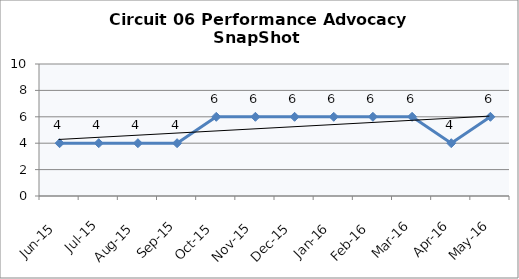
| Category | Circuit 06 |
|---|---|
| Jun-15 | 4 |
| Jul-15 | 4 |
| Aug-15 | 4 |
| Sep-15 | 4 |
| Oct-15 | 6 |
| Nov-15 | 6 |
| Dec-15 | 6 |
| Jan-16 | 6 |
| Feb-16 | 6 |
| Mar-16 | 6 |
| Apr-16 | 4 |
| May-16 | 6 |